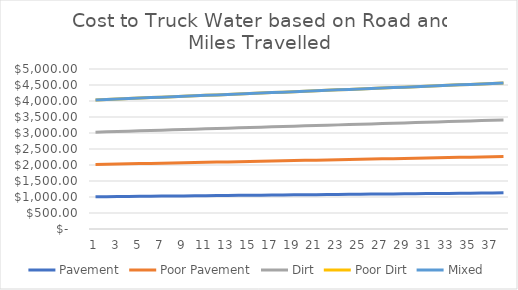
| Category | Pavement | Poor Pavement | Dirt | Poor Dirt | Mixed |
|---|---|---|---|---|---|
| 0 | 1008.277 | 1008.461 | 1008.649 | 1008.865 | 0 |
| 1 | 1011.554 | 1011.923 | 1012.298 | 1012.729 | 0 |
| 2 | 1014.831 | 1015.384 | 1015.947 | 1016.594 | 0 |
| 3 | 1018.109 | 1018.845 | 1019.596 | 1020.458 | 0 |
| 4 | 1021.386 | 1022.307 | 1023.246 | 1024.323 | 0 |
| 5 | 1024.663 | 1025.768 | 1026.895 | 1028.187 | 0 |
| 6 | 1027.94 | 1029.23 | 1030.544 | 1032.052 | 0 |
| 7 | 1031.217 | 1032.691 | 1034.193 | 1035.917 | 0 |
| 8 | 1034.494 | 1036.152 | 1037.842 | 1039.781 | 0 |
| 9 | 1037.771 | 1039.614 | 1041.491 | 1043.646 | 0 |
| 10 | 1041.049 | 1043.075 | 1045.14 | 1047.51 | 0 |
| 11 | 1044.326 | 1046.536 | 1048.789 | 1051.375 | 0 |
| 12 | 1047.603 | 1049.998 | 1052.438 | 1055.239 | 0 |
| 13 | 1050.88 | 1053.459 | 1056.087 | 1059.104 | 0 |
| 14 | 1054.157 | 1056.921 | 1059.736 | 1062.969 | 0 |
| 15 | 1057.434 | 1060.382 | 1063.386 | 1066.833 | 0 |
| 16 | 1060.711 | 1063.843 | 1067.035 | 1070.698 | 0 |
| 17 | 1063.989 | 1067.305 | 1070.684 | 1074.562 | 0 |
| 18 | 1067.266 | 1070.766 | 1074.333 | 1078.427 | 0 |
| 19 | 1070.543 | 1074.227 | 1077.982 | 1082.291 | 0 |
| 20 | 1073.82 | 1077.689 | 1081.631 | 1086.156 | 0 |
| 21 | 1077.097 | 1081.15 | 1085.28 | 1090.021 | 0 |
| 22 | 1080.374 | 1084.612 | 1088.929 | 1093.885 | 0 |
| 23 | 1083.651 | 1088.073 | 1092.578 | 1097.75 | 0 |
| 24 | 1086.929 | 1091.534 | 1096.228 | 1101.614 | 0 |
| 25 | 1090.206 | 1094.996 | 1099.877 | 1105.479 | 0 |
| 26 | 1093.483 | 1098.457 | 1103.526 | 1109.343 | 0 |
| 27 | 1096.76 | 1101.918 | 1107.175 | 1113.208 | 0 |
| 28 | 1100.037 | 1105.38 | 1110.824 | 1117.073 | 0 |
| 29 | 1103.314 | 1108.841 | 1114.473 | 1120.937 | 0 |
| 30 | 1106.591 | 1112.303 | 1118.122 | 1124.802 | 0 |
| 31 | 1109.869 | 1115.764 | 1121.771 | 1128.666 | 0 |
| 32 | 1113.146 | 1119.225 | 1125.42 | 1132.531 | 0 |
| 33 | 1116.423 | 1122.687 | 1129.069 | 1136.395 | 0 |
| 34 | 1119.7 | 1126.148 | 1132.718 | 1140.26 | 0 |
| 35 | 1122.977 | 1129.609 | 1136.368 | 1144.125 | 0 |
| 36 | 1126.254 | 1133.071 | 1140.017 | 1147.989 | 0 |
| 37 | 1129.531 | 1136.532 | 1143.666 | 1151.854 | 0 |